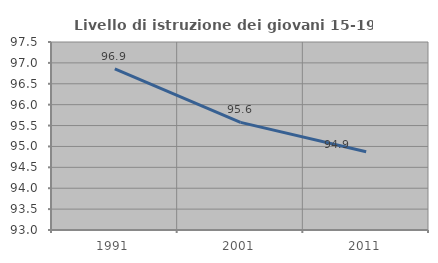
| Category | Livello di istruzione dei giovani 15-19 anni |
|---|---|
| 1991.0 | 96.858 |
| 2001.0 | 95.575 |
| 2011.0 | 94.872 |